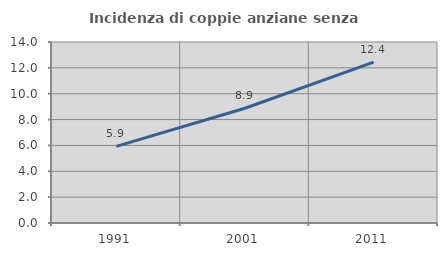
| Category | Incidenza di coppie anziane senza figli  |
|---|---|
| 1991.0 | 5.928 |
| 2001.0 | 8.875 |
| 2011.0 | 12.44 |